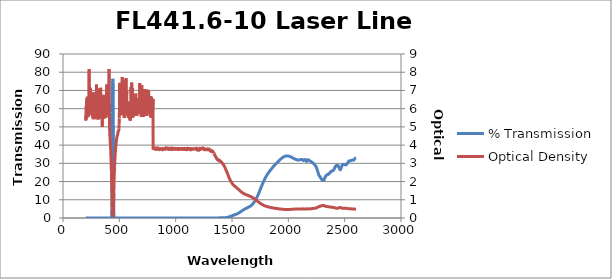
| Category | % Transmission |
|---|---|
| 2600.0 | 33.097 |
| 2599.0 | 33.076 |
| 2598.0 | 33.034 |
| 2597.0 | 32.991 |
| 2596.0 | 32.96 |
| 2595.0 | 32.897 |
| 2594.0 | 32.834 |
| 2593.0 | 32.757 |
| 2592.0 | 32.676 |
| 2591.0 | 32.586 |
| 2590.0 | 32.515 |
| 2589.0 | 32.423 |
| 2588.0 | 32.32 |
| 2587.0 | 32.237 |
| 2586.0 | 32.16 |
| 2585.0 | 32.076 |
| 2584.0 | 31.991 |
| 2583.0 | 31.912 |
| 2582.0 | 31.842 |
| 2581.0 | 31.788 |
| 2580.0 | 31.757 |
| 2579.0 | 31.745 |
| 2578.0 | 31.735 |
| 2577.0 | 31.734 |
| 2576.0 | 31.748 |
| 2575.0 | 31.771 |
| 2574.0 | 31.798 |
| 2573.0 | 31.811 |
| 2572.0 | 31.817 |
| 2571.0 | 31.827 |
| 2570.0 | 31.828 |
| 2569.0 | 31.82 |
| 2568.0 | 31.813 |
| 2567.0 | 31.79 |
| 2566.0 | 31.767 |
| 2565.0 | 31.753 |
| 2564.0 | 31.729 |
| 2563.0 | 31.7 |
| 2562.0 | 31.67 |
| 2561.0 | 31.643 |
| 2560.0 | 31.609 |
| 2559.0 | 31.592 |
| 2558.0 | 31.553 |
| 2557.0 | 31.516 |
| 2556.0 | 31.494 |
| 2555.0 | 31.468 |
| 2554.0 | 31.425 |
| 2553.0 | 31.412 |
| 2552.0 | 31.413 |
| 2551.0 | 31.398 |
| 2550.0 | 31.425 |
| 2549.0 | 31.439 |
| 2548.0 | 31.439 |
| 2547.0 | 31.455 |
| 2546.0 | 31.467 |
| 2545.0 | 31.434 |
| 2544.0 | 31.426 |
| 2543.0 | 31.407 |
| 2542.0 | 31.363 |
| 2541.0 | 31.338 |
| 2540.0 | 31.312 |
| 2539.0 | 31.266 |
| 2538.0 | 31.234 |
| 2537.0 | 31.201 |
| 2536.0 | 31.14 |
| 2535.0 | 31.068 |
| 2534.0 | 30.985 |
| 2533.0 | 30.883 |
| 2532.0 | 30.793 |
| 2531.0 | 30.695 |
| 2530.0 | 30.592 |
| 2529.0 | 30.513 |
| 2528.0 | 30.434 |
| 2527.0 | 30.346 |
| 2526.0 | 30.262 |
| 2525.0 | 30.18 |
| 2524.0 | 30.085 |
| 2523.0 | 29.988 |
| 2522.0 | 29.895 |
| 2521.0 | 29.799 |
| 2520.0 | 29.71 |
| 2519.0 | 29.618 |
| 2518.0 | 29.532 |
| 2517.0 | 29.445 |
| 2516.0 | 29.372 |
| 2515.0 | 29.309 |
| 2514.0 | 29.26 |
| 2513.0 | 29.217 |
| 2512.0 | 29.184 |
| 2511.0 | 29.152 |
| 2510.0 | 29.129 |
| 2509.0 | 29.114 |
| 2508.0 | 29.114 |
| 2507.0 | 29.12 |
| 2506.0 | 29.134 |
| 2505.0 | 29.153 |
| 2504.0 | 29.173 |
| 2503.0 | 29.196 |
| 2502.0 | 29.216 |
| 2501.0 | 29.245 |
| 2500.0 | 29.262 |
| 2499.0 | 29.299 |
| 2498.0 | 29.311 |
| 2497.0 | 29.335 |
| 2496.0 | 29.341 |
| 2495.0 | 29.348 |
| 2494.0 | 29.34 |
| 2493.0 | 29.349 |
| 2492.0 | 29.343 |
| 2491.0 | 29.355 |
| 2490.0 | 29.35 |
| 2489.0 | 29.339 |
| 2488.0 | 29.333 |
| 2487.0 | 29.339 |
| 2486.0 | 29.326 |
| 2485.0 | 29.339 |
| 2484.0 | 29.338 |
| 2483.0 | 29.317 |
| 2482.0 | 29.29 |
| 2481.0 | 29.234 |
| 2480.0 | 29.155 |
| 2479.0 | 29.076 |
| 2478.0 | 28.978 |
| 2477.0 | 28.862 |
| 2476.0 | 28.756 |
| 2475.0 | 28.604 |
| 2474.0 | 28.452 |
| 2473.0 | 28.291 |
| 2472.0 | 28.107 |
| 2471.0 | 27.926 |
| 2470.0 | 27.763 |
| 2469.0 | 27.553 |
| 2468.0 | 27.388 |
| 2467.0 | 27.193 |
| 2466.0 | 26.995 |
| 2465.0 | 26.831 |
| 2464.0 | 26.701 |
| 2463.0 | 26.574 |
| 2462.0 | 26.541 |
| 2461.0 | 26.501 |
| 2460.0 | 26.503 |
| 2459.0 | 26.556 |
| 2458.0 | 26.615 |
| 2457.0 | 26.707 |
| 2456.0 | 26.857 |
| 2455.0 | 26.957 |
| 2454.0 | 27.1 |
| 2453.0 | 27.226 |
| 2452.0 | 27.323 |
| 2451.0 | 27.448 |
| 2450.0 | 27.59 |
| 2449.0 | 27.704 |
| 2448.0 | 27.883 |
| 2447.0 | 28.006 |
| 2446.0 | 28.129 |
| 2445.0 | 28.266 |
| 2444.0 | 28.369 |
| 2443.0 | 28.484 |
| 2442.0 | 28.626 |
| 2441.0 | 28.706 |
| 2440.0 | 28.813 |
| 2439.0 | 28.882 |
| 2438.0 | 28.884 |
| 2437.0 | 28.932 |
| 2436.0 | 28.956 |
| 2435.0 | 28.957 |
| 2434.0 | 29.018 |
| 2433.0 | 28.997 |
| 2432.0 | 28.965 |
| 2431.0 | 28.96 |
| 2430.0 | 28.883 |
| 2429.0 | 28.867 |
| 2428.0 | 28.873 |
| 2427.0 | 28.818 |
| 2426.0 | 28.817 |
| 2425.0 | 28.756 |
| 2424.0 | 28.649 |
| 2423.0 | 28.612 |
| 2422.0 | 28.526 |
| 2421.0 | 28.47 |
| 2420.0 | 28.45 |
| 2419.0 | 28.34 |
| 2418.0 | 28.25 |
| 2417.0 | 28.15 |
| 2416.0 | 28.002 |
| 2415.0 | 27.94 |
| 2414.0 | 27.848 |
| 2413.0 | 27.728 |
| 2412.0 | 27.645 |
| 2411.0 | 27.461 |
| 2410.0 | 27.301 |
| 2409.0 | 27.181 |
| 2408.0 | 27.013 |
| 2407.0 | 26.924 |
| 2406.0 | 26.825 |
| 2405.0 | 26.663 |
| 2404.0 | 26.563 |
| 2403.0 | 26.42 |
| 2402.0 | 26.319 |
| 2401.0 | 26.304 |
| 2400.0 | 26.244 |
| 2399.0 | 26.233 |
| 2398.0 | 26.193 |
| 2397.0 | 26.1 |
| 2396.0 | 26.074 |
| 2395.0 | 26.032 |
| 2394.0 | 26.006 |
| 2393.0 | 26.045 |
| 2392.0 | 25.985 |
| 2391.0 | 25.944 |
| 2390.0 | 25.894 |
| 2389.0 | 25.802 |
| 2388.0 | 25.814 |
| 2387.0 | 25.799 |
| 2386.0 | 25.792 |
| 2385.0 | 25.781 |
| 2384.0 | 25.705 |
| 2383.0 | 25.638 |
| 2382.0 | 25.618 |
| 2381.0 | 25.56 |
| 2380.0 | 25.594 |
| 2379.0 | 25.536 |
| 2378.0 | 25.471 |
| 2377.0 | 25.39 |
| 2376.0 | 25.277 |
| 2375.0 | 25.214 |
| 2374.0 | 25.184 |
| 2373.0 | 25.126 |
| 2372.0 | 25.073 |
| 2371.0 | 24.97 |
| 2370.0 | 24.848 |
| 2369.0 | 24.792 |
| 2368.0 | 24.7 |
| 2367.0 | 24.71 |
| 2366.0 | 24.647 |
| 2365.0 | 24.581 |
| 2364.0 | 24.501 |
| 2363.0 | 24.42 |
| 2362.0 | 24.378 |
| 2361.0 | 24.387 |
| 2360.0 | 24.369 |
| 2359.0 | 24.356 |
| 2358.0 | 24.282 |
| 2357.0 | 24.178 |
| 2356.0 | 24.137 |
| 2355.0 | 24.055 |
| 2354.0 | 24.068 |
| 2353.0 | 24.004 |
| 2352.0 | 23.946 |
| 2351.0 | 23.861 |
| 2350.0 | 23.781 |
| 2349.0 | 23.756 |
| 2348.0 | 23.765 |
| 2347.0 | 23.772 |
| 2346.0 | 23.762 |
| 2345.0 | 23.717 |
| 2344.0 | 23.641 |
| 2343.0 | 23.632 |
| 2342.0 | 23.587 |
| 2341.0 | 23.631 |
| 2340.0 | 23.584 |
| 2339.0 | 23.524 |
| 2338.0 | 23.451 |
| 2337.0 | 23.341 |
| 2336.0 | 23.305 |
| 2335.0 | 23.25 |
| 2334.0 | 23.197 |
| 2333.0 | 23.111 |
| 2332.0 | 22.973 |
| 2331.0 | 22.854 |
| 2330.0 | 22.752 |
| 2329.0 | 22.65 |
| 2328.0 | 22.598 |
| 2327.0 | 22.459 |
| 2326.0 | 22.337 |
| 2325.0 | 22.171 |
| 2324.0 | 21.999 |
| 2323.0 | 21.887 |
| 2322.0 | 21.725 |
| 2321.0 | 21.579 |
| 2320.0 | 21.396 |
| 2319.0 | 21.189 |
| 2318.0 | 21.052 |
| 2317.0 | 20.906 |
| 2316.0 | 20.84 |
| 2315.0 | 20.795 |
| 2314.0 | 20.727 |
| 2313.0 | 20.715 |
| 2312.0 | 20.678 |
| 2311.0 | 20.701 |
| 2310.0 | 20.742 |
| 2309.0 | 20.771 |
| 2308.0 | 20.809 |
| 2307.0 | 20.806 |
| 2306.0 | 20.806 |
| 2305.0 | 20.826 |
| 2304.0 | 20.838 |
| 2303.0 | 20.882 |
| 2302.0 | 20.905 |
| 2301.0 | 20.921 |
| 2300.0 | 20.967 |
| 2299.0 | 20.998 |
| 2298.0 | 21.082 |
| 2297.0 | 21.144 |
| 2296.0 | 21.233 |
| 2295.0 | 21.309 |
| 2294.0 | 21.38 |
| 2293.0 | 21.467 |
| 2292.0 | 21.554 |
| 2291.0 | 21.658 |
| 2290.0 | 21.755 |
| 2289.0 | 21.854 |
| 2288.0 | 21.951 |
| 2287.0 | 22.052 |
| 2286.0 | 22.158 |
| 2285.0 | 22.268 |
| 2284.0 | 22.373 |
| 2283.0 | 22.481 |
| 2282.0 | 22.57 |
| 2281.0 | 22.663 |
| 2280.0 | 22.739 |
| 2279.0 | 22.821 |
| 2278.0 | 22.889 |
| 2277.0 | 22.956 |
| 2276.0 | 23.037 |
| 2275.0 | 23.103 |
| 2274.0 | 23.207 |
| 2273.0 | 23.305 |
| 2272.0 | 23.437 |
| 2271.0 | 23.582 |
| 2270.0 | 23.742 |
| 2269.0 | 23.938 |
| 2268.0 | 24.116 |
| 2267.0 | 24.321 |
| 2266.0 | 24.516 |
| 2265.0 | 24.714 |
| 2264.0 | 24.928 |
| 2263.0 | 25.122 |
| 2262.0 | 25.334 |
| 2261.0 | 25.521 |
| 2260.0 | 25.719 |
| 2259.0 | 25.914 |
| 2258.0 | 26.093 |
| 2257.0 | 26.299 |
| 2256.0 | 26.481 |
| 2255.0 | 26.669 |
| 2254.0 | 26.856 |
| 2253.0 | 27.028 |
| 2252.0 | 27.202 |
| 2251.0 | 27.366 |
| 2250.0 | 27.541 |
| 2249.0 | 27.694 |
| 2248.0 | 27.841 |
| 2247.0 | 27.986 |
| 2246.0 | 28.114 |
| 2245.0 | 28.239 |
| 2244.0 | 28.36 |
| 2243.0 | 28.479 |
| 2242.0 | 28.578 |
| 2241.0 | 28.671 |
| 2240.0 | 28.76 |
| 2239.0 | 28.838 |
| 2238.0 | 28.926 |
| 2237.0 | 29.003 |
| 2236.0 | 29.072 |
| 2235.0 | 29.137 |
| 2234.0 | 29.2 |
| 2233.0 | 29.269 |
| 2232.0 | 29.341 |
| 2231.0 | 29.418 |
| 2230.0 | 29.497 |
| 2229.0 | 29.561 |
| 2228.0 | 29.636 |
| 2227.0 | 29.71 |
| 2226.0 | 29.792 |
| 2225.0 | 29.871 |
| 2224.0 | 29.937 |
| 2223.0 | 29.999 |
| 2222.0 | 30.055 |
| 2221.0 | 30.11 |
| 2220.0 | 30.172 |
| 2219.0 | 30.213 |
| 2218.0 | 30.26 |
| 2217.0 | 30.297 |
| 2216.0 | 30.325 |
| 2215.0 | 30.372 |
| 2214.0 | 30.409 |
| 2213.0 | 30.449 |
| 2212.0 | 30.485 |
| 2211.0 | 30.509 |
| 2210.0 | 30.555 |
| 2209.0 | 30.601 |
| 2208.0 | 30.65 |
| 2207.0 | 30.7 |
| 2206.0 | 30.737 |
| 2205.0 | 30.783 |
| 2204.0 | 30.832 |
| 2203.0 | 30.888 |
| 2202.0 | 30.944 |
| 2201.0 | 30.986 |
| 2200.0 | 31.025 |
| 2199.0 | 31.071 |
| 2198.0 | 31.103 |
| 2197.0 | 31.156 |
| 2196.0 | 31.185 |
| 2195.0 | 31.208 |
| 2194.0 | 31.232 |
| 2193.0 | 31.252 |
| 2192.0 | 31.289 |
| 2191.0 | 31.323 |
| 2190.0 | 31.354 |
| 2189.0 | 31.391 |
| 2188.0 | 31.434 |
| 2187.0 | 31.485 |
| 2186.0 | 31.557 |
| 2185.0 | 31.62 |
| 2184.0 | 31.679 |
| 2183.0 | 31.741 |
| 2182.0 | 31.789 |
| 2181.0 | 31.848 |
| 2180.0 | 31.897 |
| 2179.0 | 31.935 |
| 2178.0 | 31.96 |
| 2177.0 | 31.969 |
| 2176.0 | 31.974 |
| 2175.0 | 31.96 |
| 2174.0 | 31.938 |
| 2173.0 | 31.89 |
| 2172.0 | 31.825 |
| 2171.0 | 31.739 |
| 2170.0 | 31.639 |
| 2169.0 | 31.52 |
| 2168.0 | 31.407 |
| 2167.0 | 31.286 |
| 2166.0 | 31.182 |
| 2165.0 | 31.111 |
| 2164.0 | 31.062 |
| 2163.0 | 31.054 |
| 2162.0 | 31.074 |
| 2161.0 | 31.132 |
| 2160.0 | 31.212 |
| 2159.0 | 31.315 |
| 2158.0 | 31.421 |
| 2157.0 | 31.536 |
| 2156.0 | 31.645 |
| 2155.0 | 31.754 |
| 2154.0 | 31.853 |
| 2153.0 | 31.938 |
| 2152.0 | 32.005 |
| 2151.0 | 32.057 |
| 2150.0 | 32.095 |
| 2149.0 | 32.11 |
| 2148.0 | 32.115 |
| 2147.0 | 32.1 |
| 2146.0 | 32.074 |
| 2145.0 | 32.031 |
| 2144.0 | 31.976 |
| 2143.0 | 31.909 |
| 2142.0 | 31.839 |
| 2141.0 | 31.757 |
| 2140.0 | 31.679 |
| 2139.0 | 31.607 |
| 2138.0 | 31.542 |
| 2137.0 | 31.5 |
| 2136.0 | 31.477 |
| 2135.0 | 31.478 |
| 2134.0 | 31.508 |
| 2133.0 | 31.563 |
| 2132.0 | 31.625 |
| 2131.0 | 31.707 |
| 2130.0 | 31.788 |
| 2129.0 | 31.865 |
| 2128.0 | 31.938 |
| 2127.0 | 31.992 |
| 2126.0 | 32.033 |
| 2125.0 | 32.06 |
| 2124.0 | 32.08 |
| 2123.0 | 32.09 |
| 2122.0 | 32.091 |
| 2121.0 | 32.091 |
| 2120.0 | 32.091 |
| 2119.0 | 32.092 |
| 2118.0 | 32.091 |
| 2117.0 | 32.081 |
| 2116.0 | 32.079 |
| 2115.0 | 32.075 |
| 2114.0 | 32.068 |
| 2113.0 | 32.064 |
| 2112.0 | 32.052 |
| 2111.0 | 32.037 |
| 2110.0 | 32.029 |
| 2109.0 | 32.018 |
| 2108.0 | 32.008 |
| 2107.0 | 32 |
| 2106.0 | 31.987 |
| 2105.0 | 31.972 |
| 2104.0 | 31.962 |
| 2103.0 | 31.954 |
| 2102.0 | 31.943 |
| 2101.0 | 31.929 |
| 2100.0 | 31.915 |
| 2099.0 | 31.906 |
| 2098.0 | 31.895 |
| 2097.0 | 31.886 |
| 2096.0 | 31.873 |
| 2095.0 | 31.863 |
| 2094.0 | 31.856 |
| 2093.0 | 31.852 |
| 2092.0 | 31.845 |
| 2091.0 | 31.838 |
| 2090.0 | 31.832 |
| 2089.0 | 31.829 |
| 2088.0 | 31.834 |
| 2087.0 | 31.834 |
| 2086.0 | 31.828 |
| 2085.0 | 31.833 |
| 2084.0 | 31.842 |
| 2083.0 | 31.847 |
| 2082.0 | 31.86 |
| 2081.0 | 31.865 |
| 2080.0 | 31.876 |
| 2079.0 | 31.892 |
| 2078.0 | 31.908 |
| 2077.0 | 31.927 |
| 2076.0 | 31.941 |
| 2075.0 | 31.958 |
| 2074.0 | 31.98 |
| 2073.0 | 32 |
| 2072.0 | 32.022 |
| 2071.0 | 32.048 |
| 2070.0 | 32.065 |
| 2069.0 | 32.091 |
| 2068.0 | 32.119 |
| 2067.0 | 32.142 |
| 2066.0 | 32.167 |
| 2065.0 | 32.191 |
| 2064.0 | 32.221 |
| 2063.0 | 32.25 |
| 2062.0 | 32.276 |
| 2061.0 | 32.305 |
| 2060.0 | 32.326 |
| 2059.0 | 32.356 |
| 2058.0 | 32.391 |
| 2057.0 | 32.419 |
| 2056.0 | 32.444 |
| 2055.0 | 32.471 |
| 2054.0 | 32.501 |
| 2053.0 | 32.536 |
| 2052.0 | 32.562 |
| 2051.0 | 32.594 |
| 2050.0 | 32.618 |
| 2049.0 | 32.651 |
| 2048.0 | 32.691 |
| 2047.0 | 32.718 |
| 2046.0 | 32.742 |
| 2045.0 | 32.778 |
| 2044.0 | 32.815 |
| 2043.0 | 32.851 |
| 2042.0 | 32.879 |
| 2041.0 | 32.913 |
| 2040.0 | 32.947 |
| 2039.0 | 32.979 |
| 2038.0 | 33.024 |
| 2037.0 | 33.057 |
| 2036.0 | 33.089 |
| 2035.0 | 33.122 |
| 2034.0 | 33.162 |
| 2033.0 | 33.2 |
| 2032.0 | 33.231 |
| 2031.0 | 33.266 |
| 2030.0 | 33.298 |
| 2029.0 | 33.336 |
| 2028.0 | 33.365 |
| 2027.0 | 33.396 |
| 2026.0 | 33.427 |
| 2025.0 | 33.459 |
| 2024.0 | 33.492 |
| 2023.0 | 33.516 |
| 2022.0 | 33.55 |
| 2021.0 | 33.571 |
| 2020.0 | 33.603 |
| 2019.0 | 33.63 |
| 2018.0 | 33.66 |
| 2017.0 | 33.677 |
| 2016.0 | 33.7 |
| 2015.0 | 33.735 |
| 2014.0 | 33.754 |
| 2013.0 | 33.776 |
| 2012.0 | 33.793 |
| 2011.0 | 33.823 |
| 2010.0 | 33.843 |
| 2009.0 | 33.866 |
| 2008.0 | 33.881 |
| 2007.0 | 33.906 |
| 2006.0 | 33.927 |
| 2005.0 | 33.942 |
| 2004.0 | 33.962 |
| 2003.0 | 33.977 |
| 2002.0 | 33.992 |
| 2001.0 | 34.005 |
| 2000.0 | 34.02 |
| 1999.0 | 34.034 |
| 1998.0 | 34.045 |
| 1997.0 | 34.05 |
| 1996.0 | 34.065 |
| 1995.0 | 34.067 |
| 1994.0 | 34.077 |
| 1993.0 | 34.079 |
| 1992.0 | 34.086 |
| 1991.0 | 34.092 |
| 1990.0 | 34.094 |
| 1989.0 | 34.091 |
| 1988.0 | 34.089 |
| 1987.0 | 34.094 |
| 1986.0 | 34.088 |
| 1985.0 | 34.081 |
| 1984.0 | 34.074 |
| 1983.0 | 34.069 |
| 1982.0 | 34.061 |
| 1981.0 | 34.053 |
| 1980.0 | 34.029 |
| 1979.0 | 34.024 |
| 1978.0 | 34.012 |
| 1977.0 | 33.999 |
| 1976.0 | 33.981 |
| 1975.0 | 33.966 |
| 1974.0 | 33.949 |
| 1973.0 | 33.929 |
| 1972.0 | 33.907 |
| 1971.0 | 33.879 |
| 1970.0 | 33.866 |
| 1969.0 | 33.845 |
| 1968.0 | 33.82 |
| 1967.0 | 33.79 |
| 1966.0 | 33.761 |
| 1965.0 | 33.739 |
| 1964.0 | 33.714 |
| 1963.0 | 33.68 |
| 1962.0 | 33.65 |
| 1961.0 | 33.621 |
| 1960.0 | 33.59 |
| 1959.0 | 33.56 |
| 1958.0 | 33.521 |
| 1957.0 | 33.488 |
| 1956.0 | 33.456 |
| 1955.0 | 33.42 |
| 1954.0 | 33.378 |
| 1953.0 | 33.337 |
| 1952.0 | 33.302 |
| 1951.0 | 33.264 |
| 1950.0 | 33.222 |
| 1949.0 | 33.172 |
| 1948.0 | 33.131 |
| 1947.0 | 33.086 |
| 1946.0 | 33.046 |
| 1945.0 | 32.996 |
| 1944.0 | 32.945 |
| 1943.0 | 32.892 |
| 1942.0 | 32.849 |
| 1941.0 | 32.799 |
| 1940.0 | 32.748 |
| 1939.0 | 32.691 |
| 1938.0 | 32.634 |
| 1937.0 | 32.578 |
| 1936.0 | 32.523 |
| 1935.0 | 32.474 |
| 1934.0 | 32.423 |
| 1933.0 | 32.37 |
| 1932.0 | 32.313 |
| 1931.0 | 32.27 |
| 1930.0 | 32.224 |
| 1929.0 | 32.168 |
| 1928.0 | 32.112 |
| 1927.0 | 32.051 |
| 1926.0 | 31.995 |
| 1925.0 | 31.925 |
| 1924.0 | 31.856 |
| 1923.0 | 31.795 |
| 1922.0 | 31.751 |
| 1921.0 | 31.705 |
| 1920.0 | 31.646 |
| 1919.0 | 31.579 |
| 1918.0 | 31.515 |
| 1917.0 | 31.462 |
| 1916.0 | 31.409 |
| 1915.0 | 31.349 |
| 1914.0 | 31.291 |
| 1913.0 | 31.226 |
| 1912.0 | 31.149 |
| 1911.0 | 31.075 |
| 1910.0 | 31.014 |
| 1909.0 | 30.959 |
| 1908.0 | 30.906 |
| 1907.0 | 30.835 |
| 1906.0 | 30.77 |
| 1905.0 | 30.717 |
| 1904.0 | 30.657 |
| 1903.0 | 30.605 |
| 1902.0 | 30.547 |
| 1901.0 | 30.483 |
| 1900.0 | 30.418 |
| 1899.0 | 30.353 |
| 1898.0 | 30.294 |
| 1897.0 | 30.24 |
| 1896.0 | 30.18 |
| 1895.0 | 30.112 |
| 1894.0 | 30.044 |
| 1893.0 | 29.984 |
| 1892.0 | 29.931 |
| 1891.0 | 29.862 |
| 1890.0 | 29.786 |
| 1889.0 | 29.718 |
| 1888.0 | 29.664 |
| 1887.0 | 29.608 |
| 1886.0 | 29.544 |
| 1885.0 | 29.476 |
| 1884.0 | 29.404 |
| 1883.0 | 29.336 |
| 1882.0 | 29.267 |
| 1881.0 | 29.201 |
| 1880.0 | 29.133 |
| 1879.0 | 29.068 |
| 1878.0 | 28.992 |
| 1877.0 | 28.913 |
| 1876.0 | 28.849 |
| 1875.0 | 28.803 |
| 1874.0 | 28.748 |
| 1873.0 | 28.685 |
| 1872.0 | 28.608 |
| 1871.0 | 28.522 |
| 1870.0 | 28.454 |
| 1869.0 | 28.372 |
| 1868.0 | 28.286 |
| 1867.0 | 28.207 |
| 1866.0 | 28.136 |
| 1865.0 | 28.066 |
| 1864.0 | 27.988 |
| 1863.0 | 27.918 |
| 1862.0 | 27.845 |
| 1861.0 | 27.765 |
| 1860.0 | 27.679 |
| 1859.0 | 27.606 |
| 1858.0 | 27.548 |
| 1857.0 | 27.488 |
| 1856.0 | 27.417 |
| 1855.0 | 27.324 |
| 1854.0 | 27.234 |
| 1853.0 | 27.147 |
| 1852.0 | 27.075 |
| 1851.0 | 27.007 |
| 1850.0 | 26.949 |
| 1849.0 | 26.867 |
| 1848.0 | 26.773 |
| 1847.0 | 26.682 |
| 1846.0 | 26.602 |
| 1845.0 | 26.536 |
| 1844.0 | 26.477 |
| 1843.0 | 26.413 |
| 1842.0 | 26.335 |
| 1841.0 | 26.247 |
| 1840.0 | 26.162 |
| 1839.0 | 26.082 |
| 1838.0 | 26.009 |
| 1837.0 | 25.94 |
| 1836.0 | 25.859 |
| 1835.0 | 25.773 |
| 1834.0 | 25.683 |
| 1833.0 | 25.595 |
| 1832.0 | 25.502 |
| 1831.0 | 25.405 |
| 1830.0 | 25.317 |
| 1829.0 | 25.224 |
| 1828.0 | 25.163 |
| 1827.0 | 25.085 |
| 1826.0 | 25.008 |
| 1825.0 | 24.91 |
| 1824.0 | 24.828 |
| 1823.0 | 24.748 |
| 1822.0 | 24.661 |
| 1821.0 | 24.577 |
| 1820.0 | 24.472 |
| 1819.0 | 24.382 |
| 1818.0 | 24.287 |
| 1817.0 | 24.204 |
| 1816.0 | 24.105 |
| 1815.0 | 24.011 |
| 1814.0 | 23.919 |
| 1813.0 | 23.823 |
| 1812.0 | 23.731 |
| 1811.0 | 23.625 |
| 1810.0 | 23.529 |
| 1809.0 | 23.433 |
| 1808.0 | 23.336 |
| 1807.0 | 23.232 |
| 1806.0 | 23.126 |
| 1805.0 | 23.025 |
| 1804.0 | 22.919 |
| 1803.0 | 22.82 |
| 1802.0 | 22.714 |
| 1801.0 | 22.602 |
| 1800.0 | 22.491 |
| 1799.0 | 22.378 |
| 1798.0 | 22.272 |
| 1797.0 | 22.156 |
| 1796.0 | 22.042 |
| 1795.0 | 21.924 |
| 1794.0 | 21.804 |
| 1793.0 | 21.688 |
| 1792.0 | 21.566 |
| 1791.0 | 21.449 |
| 1790.0 | 21.323 |
| 1789.0 | 21.206 |
| 1788.0 | 21.074 |
| 1787.0 | 20.945 |
| 1786.0 | 20.821 |
| 1785.0 | 20.69 |
| 1784.0 | 20.559 |
| 1783.0 | 20.424 |
| 1782.0 | 20.29 |
| 1781.0 | 20.147 |
| 1780.0 | 20.01 |
| 1779.0 | 19.871 |
| 1778.0 | 19.725 |
| 1777.0 | 19.583 |
| 1776.0 | 19.434 |
| 1775.0 | 19.286 |
| 1774.0 | 19.14 |
| 1773.0 | 18.99 |
| 1772.0 | 18.84 |
| 1771.0 | 18.692 |
| 1770.0 | 18.547 |
| 1769.0 | 18.395 |
| 1768.0 | 18.246 |
| 1767.0 | 18.102 |
| 1766.0 | 17.954 |
| 1765.0 | 17.809 |
| 1764.0 | 17.668 |
| 1763.0 | 17.522 |
| 1762.0 | 17.368 |
| 1761.0 | 17.224 |
| 1760.0 | 17.08 |
| 1759.0 | 16.926 |
| 1758.0 | 16.781 |
| 1757.0 | 16.63 |
| 1756.0 | 16.475 |
| 1755.0 | 16.318 |
| 1754.0 | 16.164 |
| 1753.0 | 16.01 |
| 1752.0 | 15.848 |
| 1751.0 | 15.693 |
| 1750.0 | 15.53 |
| 1749.0 | 15.369 |
| 1748.0 | 15.21 |
| 1747.0 | 15.046 |
| 1746.0 | 14.891 |
| 1745.0 | 14.73 |
| 1744.0 | 14.569 |
| 1743.0 | 14.403 |
| 1742.0 | 14.242 |
| 1741.0 | 14.088 |
| 1740.0 | 13.929 |
| 1739.0 | 13.779 |
| 1738.0 | 13.633 |
| 1737.0 | 13.477 |
| 1736.0 | 13.33 |
| 1735.0 | 13.19 |
| 1734.0 | 13.044 |
| 1733.0 | 12.905 |
| 1732.0 | 12.775 |
| 1731.0 | 12.637 |
| 1730.0 | 12.494 |
| 1729.0 | 12.359 |
| 1728.0 | 12.233 |
| 1727.0 | 12.095 |
| 1726.0 | 11.956 |
| 1725.0 | 11.83 |
| 1724.0 | 11.694 |
| 1723.0 | 11.557 |
| 1722.0 | 11.437 |
| 1721.0 | 11.316 |
| 1720.0 | 11.19 |
| 1719.0 | 11.071 |
| 1718.0 | 10.959 |
| 1717.0 | 10.843 |
| 1716.0 | 10.723 |
| 1715.0 | 10.616 |
| 1714.0 | 10.505 |
| 1713.0 | 10.388 |
| 1712.0 | 10.273 |
| 1711.0 | 10.158 |
| 1710.0 | 10.042 |
| 1709.0 | 9.927 |
| 1708.0 | 9.817 |
| 1707.0 | 9.706 |
| 1706.0 | 9.595 |
| 1705.0 | 9.484 |
| 1704.0 | 9.376 |
| 1703.0 | 9.27 |
| 1702.0 | 9.164 |
| 1701.0 | 9.068 |
| 1700.0 | 8.971 |
| 1699.0 | 8.88 |
| 1698.0 | 8.797 |
| 1697.0 | 8.714 |
| 1696.0 | 8.631 |
| 1695.0 | 8.556 |
| 1694.0 | 8.481 |
| 1693.0 | 8.393 |
| 1692.0 | 8.305 |
| 1691.0 | 8.225 |
| 1690.0 | 8.142 |
| 1689.0 | 8.061 |
| 1688.0 | 7.985 |
| 1687.0 | 7.922 |
| 1686.0 | 7.854 |
| 1685.0 | 7.785 |
| 1684.0 | 7.733 |
| 1683.0 | 7.665 |
| 1682.0 | 7.601 |
| 1681.0 | 7.544 |
| 1680.0 | 7.477 |
| 1679.0 | 7.404 |
| 1678.0 | 7.332 |
| 1677.0 | 7.265 |
| 1676.0 | 7.187 |
| 1675.0 | 7.115 |
| 1674.0 | 7.049 |
| 1673.0 | 6.974 |
| 1672.0 | 6.905 |
| 1671.0 | 6.85 |
| 1670.0 | 6.792 |
| 1669.0 | 6.736 |
| 1668.0 | 6.689 |
| 1667.0 | 6.65 |
| 1666.0 | 6.608 |
| 1665.0 | 6.576 |
| 1664.0 | 6.541 |
| 1663.0 | 6.511 |
| 1662.0 | 6.481 |
| 1661.0 | 6.453 |
| 1660.0 | 6.412 |
| 1659.0 | 6.373 |
| 1658.0 | 6.345 |
| 1657.0 | 6.305 |
| 1656.0 | 6.265 |
| 1655.0 | 6.228 |
| 1654.0 | 6.187 |
| 1653.0 | 6.147 |
| 1652.0 | 6.113 |
| 1651.0 | 6.075 |
| 1650.0 | 6.035 |
| 1649.0 | 6 |
| 1648.0 | 5.966 |
| 1647.0 | 5.926 |
| 1646.0 | 5.89 |
| 1645.0 | 5.862 |
| 1644.0 | 5.827 |
| 1643.0 | 5.799 |
| 1642.0 | 5.771 |
| 1641.0 | 5.735 |
| 1640.0 | 5.704 |
| 1639.0 | 5.675 |
| 1638.0 | 5.644 |
| 1637.0 | 5.607 |
| 1636.0 | 5.577 |
| 1635.0 | 5.548 |
| 1634.0 | 5.512 |
| 1633.0 | 5.485 |
| 1632.0 | 5.458 |
| 1631.0 | 5.423 |
| 1630.0 | 5.399 |
| 1629.0 | 5.369 |
| 1628.0 | 5.336 |
| 1627.0 | 5.307 |
| 1626.0 | 5.276 |
| 1625.0 | 5.244 |
| 1624.0 | 5.215 |
| 1623.0 | 5.188 |
| 1622.0 | 5.156 |
| 1621.0 | 5.121 |
| 1620.0 | 5.09 |
| 1619.0 | 5.061 |
| 1618.0 | 5.03 |
| 1617.0 | 5.001 |
| 1616.0 | 4.967 |
| 1615.0 | 4.933 |
| 1614.0 | 4.902 |
| 1613.0 | 4.872 |
| 1612.0 | 4.836 |
| 1611.0 | 4.805 |
| 1610.0 | 4.771 |
| 1609.0 | 4.735 |
| 1608.0 | 4.7 |
| 1607.0 | 4.668 |
| 1606.0 | 4.632 |
| 1605.0 | 4.598 |
| 1604.0 | 4.558 |
| 1603.0 | 4.522 |
| 1602.0 | 4.486 |
| 1601.0 | 4.447 |
| 1600.0 | 4.41 |
| 1599.0 | 4.372 |
| 1598.0 | 4.332 |
| 1597.0 | 4.295 |
| 1596.0 | 4.258 |
| 1595.0 | 4.214 |
| 1594.0 | 4.173 |
| 1593.0 | 4.133 |
| 1592.0 | 4.094 |
| 1591.0 | 4.051 |
| 1590.0 | 4.012 |
| 1589.0 | 3.968 |
| 1588.0 | 3.923 |
| 1587.0 | 3.884 |
| 1586.0 | 3.84 |
| 1585.0 | 3.795 |
| 1584.0 | 3.75 |
| 1583.0 | 3.708 |
| 1582.0 | 3.668 |
| 1581.0 | 3.624 |
| 1580.0 | 3.582 |
| 1579.0 | 3.538 |
| 1578.0 | 3.497 |
| 1577.0 | 3.45 |
| 1576.0 | 3.408 |
| 1575.0 | 3.371 |
| 1574.0 | 3.326 |
| 1573.0 | 3.283 |
| 1572.0 | 3.244 |
| 1571.0 | 3.202 |
| 1570.0 | 3.161 |
| 1569.0 | 3.121 |
| 1568.0 | 3.082 |
| 1567.0 | 3.041 |
| 1566.0 | 3.001 |
| 1565.0 | 2.965 |
| 1564.0 | 2.922 |
| 1563.0 | 2.886 |
| 1562.0 | 2.845 |
| 1561.0 | 2.812 |
| 1560.0 | 2.773 |
| 1559.0 | 2.736 |
| 1558.0 | 2.701 |
| 1557.0 | 2.664 |
| 1556.0 | 2.631 |
| 1555.0 | 2.596 |
| 1554.0 | 2.561 |
| 1553.0 | 2.529 |
| 1552.0 | 2.499 |
| 1551.0 | 2.462 |
| 1550.0 | 2.431 |
| 1549.0 | 2.399 |
| 1548.0 | 2.365 |
| 1547.0 | 2.338 |
| 1546.0 | 2.31 |
| 1545.0 | 2.28 |
| 1544.0 | 2.25 |
| 1543.0 | 2.224 |
| 1542.0 | 2.194 |
| 1541.0 | 2.17 |
| 1540.0 | 2.14 |
| 1539.0 | 2.115 |
| 1538.0 | 2.09 |
| 1537.0 | 2.065 |
| 1536.0 | 2.04 |
| 1535.0 | 2.015 |
| 1534.0 | 1.992 |
| 1533.0 | 1.969 |
| 1532.0 | 1.944 |
| 1531.0 | 1.921 |
| 1530.0 | 1.899 |
| 1529.0 | 1.877 |
| 1528.0 | 1.854 |
| 1527.0 | 1.833 |
| 1526.0 | 1.81 |
| 1525.0 | 1.789 |
| 1524.0 | 1.766 |
| 1523.0 | 1.749 |
| 1522.0 | 1.726 |
| 1521.0 | 1.705 |
| 1520.0 | 1.682 |
| 1519.0 | 1.661 |
| 1518.0 | 1.64 |
| 1517.0 | 1.618 |
| 1516.0 | 1.597 |
| 1515.0 | 1.574 |
| 1514.0 | 1.552 |
| 1513.0 | 1.53 |
| 1512.0 | 1.508 |
| 1511.0 | 1.487 |
| 1510.0 | 1.465 |
| 1509.0 | 1.443 |
| 1508.0 | 1.421 |
| 1507.0 | 1.395 |
| 1506.0 | 1.373 |
| 1505.0 | 1.35 |
| 1504.0 | 1.327 |
| 1503.0 | 1.302 |
| 1502.0 | 1.278 |
| 1501.0 | 1.254 |
| 1500.0 | 1.228 |
| 1499.0 | 1.206 |
| 1498.0 | 1.179 |
| 1497.0 | 1.153 |
| 1496.0 | 1.128 |
| 1495.0 | 1.104 |
| 1494.0 | 1.078 |
| 1493.0 | 1.051 |
| 1492.0 | 1.027 |
| 1491.0 | 1.001 |
| 1490.0 | 0.976 |
| 1489.0 | 0.955 |
| 1488.0 | 0.926 |
| 1487.0 | 0.9 |
| 1486.0 | 0.876 |
| 1485.0 | 0.852 |
| 1484.0 | 0.827 |
| 1483.0 | 0.801 |
| 1482.0 | 0.78 |
| 1481.0 | 0.754 |
| 1480.0 | 0.731 |
| 1479.0 | 0.71 |
| 1478.0 | 0.687 |
| 1477.0 | 0.663 |
| 1476.0 | 0.644 |
| 1475.0 | 0.619 |
| 1474.0 | 0.6 |
| 1473.0 | 0.579 |
| 1472.0 | 0.56 |
| 1471.0 | 0.542 |
| 1470.0 | 0.523 |
| 1469.0 | 0.506 |
| 1468.0 | 0.489 |
| 1467.0 | 0.472 |
| 1466.0 | 0.453 |
| 1465.0 | 0.437 |
| 1464.0 | 0.424 |
| 1463.0 | 0.407 |
| 1462.0 | 0.395 |
| 1461.0 | 0.382 |
| 1460.0 | 0.367 |
| 1459.0 | 0.354 |
| 1458.0 | 0.343 |
| 1457.0 | 0.326 |
| 1456.0 | 0.318 |
| 1455.0 | 0.305 |
| 1454.0 | 0.295 |
| 1453.0 | 0.285 |
| 1452.0 | 0.277 |
| 1451.0 | 0.267 |
| 1450.0 | 0.259 |
| 1449.0 | 0.248 |
| 1448.0 | 0.241 |
| 1447.0 | 0.233 |
| 1446.0 | 0.227 |
| 1445.0 | 0.217 |
| 1444.0 | 0.208 |
| 1443.0 | 0.203 |
| 1442.0 | 0.199 |
| 1441.0 | 0.19 |
| 1440.0 | 0.185 |
| 1439.0 | 0.18 |
| 1438.0 | 0.175 |
| 1437.0 | 0.171 |
| 1436.0 | 0.164 |
| 1435.0 | 0.159 |
| 1434.0 | 0.154 |
| 1433.0 | 0.151 |
| 1432.0 | 0.148 |
| 1431.0 | 0.141 |
| 1430.0 | 0.137 |
| 1429.0 | 0.136 |
| 1428.0 | 0.13 |
| 1427.0 | 0.129 |
| 1426.0 | 0.125 |
| 1425.0 | 0.125 |
| 1424.0 | 0.121 |
| 1423.0 | 0.121 |
| 1422.0 | 0.114 |
| 1421.0 | 0.115 |
| 1420.0 | 0.108 |
| 1419.0 | 0.108 |
| 1418.0 | 0.107 |
| 1417.0 | 0.102 |
| 1416.0 | 0.102 |
| 1415.0 | 0.101 |
| 1414.0 | 0.096 |
| 1413.0 | 0.094 |
| 1412.0 | 0.095 |
| 1411.0 | 0.093 |
| 1410.0 | 0.09 |
| 1409.0 | 0.09 |
| 1408.0 | 0.088 |
| 1407.0 | 0.087 |
| 1406.0 | 0.086 |
| 1405.0 | 0.086 |
| 1404.0 | 0.085 |
| 1403.0 | 0.081 |
| 1402.0 | 0.081 |
| 1401.0 | 0.078 |
| 1400.0 | 0.081 |
| 1399.0 | 0.078 |
| 1398.0 | 0.078 |
| 1397.0 | 0.077 |
| 1396.0 | 0.079 |
| 1395.0 | 0.075 |
| 1394.0 | 0.073 |
| 1393.0 | 0.074 |
| 1392.0 | 0.072 |
| 1391.0 | 0.072 |
| 1390.0 | 0.072 |
| 1389.0 | 0.072 |
| 1388.0 | 0.073 |
| 1387.0 | 0.069 |
| 1386.0 | 0.068 |
| 1385.0 | 0.069 |
| 1384.0 | 0.069 |
| 1383.0 | 0.072 |
| 1382.0 | 0.066 |
| 1381.0 | 0.067 |
| 1380.0 | 0.065 |
| 1379.0 | 0.064 |
| 1378.0 | 0.068 |
| 1377.0 | 0.063 |
| 1376.0 | 0.064 |
| 1375.0 | 0.063 |
| 1374.0 | 0.063 |
| 1373.0 | 0.064 |
| 1372.0 | 0.061 |
| 1371.0 | 0.061 |
| 1370.0 | 0.059 |
| 1369.0 | 0.058 |
| 1368.0 | 0.061 |
| 1367.0 | 0.056 |
| 1366.0 | 0.053 |
| 1365.0 | 0.057 |
| 1364.0 | 0.053 |
| 1363.0 | 0.052 |
| 1362.0 | 0.053 |
| 1361.0 | 0.05 |
| 1360.0 | 0.05 |
| 1359.0 | 0.05 |
| 1358.0 | 0.047 |
| 1357.0 | 0.046 |
| 1356.0 | 0.044 |
| 1355.0 | 0.044 |
| 1354.0 | 0.041 |
| 1353.0 | 0.041 |
| 1352.0 | 0.041 |
| 1351.0 | 0.038 |
| 1350.0 | 0.039 |
| 1349.0 | 0.038 |
| 1348.0 | 0.038 |
| 1347.0 | 0.036 |
| 1346.0 | 0.033 |
| 1345.0 | 0.033 |
| 1344.0 | 0.03 |
| 1343.0 | 0.029 |
| 1342.0 | 0.032 |
| 1341.0 | 0.03 |
| 1340.0 | 0.028 |
| 1339.0 | 0.027 |
| 1338.0 | 0.027 |
| 1337.0 | 0.026 |
| 1336.0 | 0.028 |
| 1335.0 | 0.024 |
| 1334.0 | 0.026 |
| 1333.0 | 0.024 |
| 1332.0 | 0.024 |
| 1331.0 | 0.025 |
| 1330.0 | 0.023 |
| 1329.0 | 0.024 |
| 1328.0 | 0.023 |
| 1327.0 | 0.021 |
| 1326.0 | 0.022 |
| 1325.0 | 0.022 |
| 1324.0 | 0.019 |
| 1323.0 | 0.019 |
| 1322.0 | 0.022 |
| 1321.0 | 0.024 |
| 1320.0 | 0.02 |
| 1319.0 | 0.02 |
| 1318.0 | 0.022 |
| 1317.0 | 0.022 |
| 1316.0 | 0.021 |
| 1315.0 | 0.021 |
| 1314.0 | 0.021 |
| 1313.0 | 0.019 |
| 1312.0 | 0.02 |
| 1311.0 | 0.021 |
| 1310.0 | 0.019 |
| 1309.0 | 0.019 |
| 1308.0 | 0.019 |
| 1307.0 | 0.018 |
| 1306.0 | 0.019 |
| 1305.0 | 0.018 |
| 1304.0 | 0.02 |
| 1303.0 | 0.02 |
| 1302.0 | 0.017 |
| 1301.0 | 0.02 |
| 1300.0 | 0.018 |
| 1299.0 | 0.02 |
| 1298.0 | 0.02 |
| 1297.0 | 0.017 |
| 1296.0 | 0.02 |
| 1295.0 | 0.018 |
| 1294.0 | 0.014 |
| 1293.0 | 0.019 |
| 1292.0 | 0.018 |
| 1291.0 | 0.015 |
| 1290.0 | 0.02 |
| 1289.0 | 0.017 |
| 1288.0 | 0.017 |
| 1287.0 | 0.018 |
| 1286.0 | 0.018 |
| 1285.0 | 0.017 |
| 1284.0 | 0.018 |
| 1283.0 | 0.018 |
| 1282.0 | 0.017 |
| 1281.0 | 0.019 |
| 1280.0 | 0.015 |
| 1279.0 | 0.017 |
| 1278.0 | 0.018 |
| 1277.0 | 0.014 |
| 1276.0 | 0.016 |
| 1275.0 | 0.017 |
| 1274.0 | 0.017 |
| 1273.0 | 0.018 |
| 1272.0 | 0.017 |
| 1271.0 | 0.018 |
| 1270.0 | 0.014 |
| 1269.0 | 0.017 |
| 1268.0 | 0.018 |
| 1267.0 | 0.017 |
| 1266.0 | 0.018 |
| 1265.0 | 0.017 |
| 1264.0 | 0.015 |
| 1263.0 | 0.018 |
| 1262.0 | 0.015 |
| 1261.0 | 0.016 |
| 1260.0 | 0.018 |
| 1259.0 | 0.016 |
| 1258.0 | 0.015 |
| 1257.0 | 0.017 |
| 1256.0 | 0.017 |
| 1255.0 | 0.015 |
| 1254.0 | 0.015 |
| 1253.0 | 0.018 |
| 1252.0 | 0.018 |
| 1251.0 | 0.017 |
| 1250.0 | 0.015 |
| 1249.0 | 0.015 |
| 1248.0 | 0.016 |
| 1247.0 | 0.016 |
| 1246.0 | 0.017 |
| 1245.0 | 0.017 |
| 1244.0 | 0.014 |
| 1243.0 | 0.017 |
| 1242.0 | 0.016 |
| 1241.0 | 0.014 |
| 1240.0 | 0.015 |
| 1239.0 | 0.017 |
| 1238.0 | 0.018 |
| 1237.0 | 0.014 |
| 1236.0 | 0.016 |
| 1235.0 | 0.018 |
| 1234.0 | 0.014 |
| 1233.0 | 0.018 |
| 1232.0 | 0.014 |
| 1231.0 | 0.018 |
| 1230.0 | 0.014 |
| 1229.0 | 0.017 |
| 1228.0 | 0.016 |
| 1227.0 | 0.017 |
| 1226.0 | 0.014 |
| 1225.0 | 0.017 |
| 1224.0 | 0.017 |
| 1223.0 | 0.014 |
| 1222.0 | 0.016 |
| 1221.0 | 0.016 |
| 1220.0 | 0.019 |
| 1219.0 | 0.015 |
| 1218.0 | 0.015 |
| 1217.0 | 0.015 |
| 1216.0 | 0.015 |
| 1215.0 | 0.017 |
| 1214.0 | 0.017 |
| 1213.0 | 0.017 |
| 1212.0 | 0.016 |
| 1211.0 | 0.017 |
| 1210.0 | 0.016 |
| 1209.0 | 0.015 |
| 1208.0 | 0.017 |
| 1207.0 | 0.017 |
| 1206.0 | 0.019 |
| 1205.0 | 0.018 |
| 1204.0 | 0.014 |
| 1203.0 | 0.016 |
| 1202.0 | 0.017 |
| 1201.0 | 0.016 |
| 1200.0 | 0.016 |
| 1199.0 | 0.022 |
| 1198.0 | 0.017 |
| 1197.0 | 0.016 |
| 1196.0 | 0.016 |
| 1195.0 | 0.019 |
| 1194.0 | 0.017 |
| 1193.0 | 0.017 |
| 1192.0 | 0.016 |
| 1191.0 | 0.016 |
| 1190.0 | 0.015 |
| 1189.0 | 0.015 |
| 1188.0 | 0.015 |
| 1187.0 | 0.015 |
| 1186.0 | 0.017 |
| 1185.0 | 0.017 |
| 1184.0 | 0.015 |
| 1183.0 | 0.017 |
| 1182.0 | 0.016 |
| 1181.0 | 0.016 |
| 1180.0 | 0.016 |
| 1179.0 | 0.017 |
| 1178.0 | 0.017 |
| 1177.0 | 0.018 |
| 1176.0 | 0.016 |
| 1175.0 | 0.018 |
| 1174.0 | 0.014 |
| 1173.0 | 0.015 |
| 1172.0 | 0.018 |
| 1171.0 | 0.014 |
| 1170.0 | 0.016 |
| 1169.0 | 0.016 |
| 1168.0 | 0.014 |
| 1167.0 | 0.018 |
| 1166.0 | 0.016 |
| 1165.0 | 0.015 |
| 1164.0 | 0.016 |
| 1163.0 | 0.014 |
| 1162.0 | 0.015 |
| 1161.0 | 0.016 |
| 1160.0 | 0.017 |
| 1159.0 | 0.015 |
| 1158.0 | 0.015 |
| 1157.0 | 0.017 |
| 1156.0 | 0.016 |
| 1155.0 | 0.017 |
| 1154.0 | 0.016 |
| 1153.0 | 0.017 |
| 1152.0 | 0.019 |
| 1151.0 | 0.015 |
| 1150.0 | 0.018 |
| 1149.0 | 0.014 |
| 1148.0 | 0.015 |
| 1147.0 | 0.014 |
| 1146.0 | 0.014 |
| 1145.0 | 0.016 |
| 1144.0 | 0.015 |
| 1143.0 | 0.018 |
| 1142.0 | 0.018 |
| 1141.0 | 0.016 |
| 1140.0 | 0.016 |
| 1139.0 | 0.016 |
| 1138.0 | 0.016 |
| 1137.0 | 0.018 |
| 1136.0 | 0.017 |
| 1135.0 | 0.016 |
| 1134.0 | 0.019 |
| 1133.0 | 0.017 |
| 1132.0 | 0.017 |
| 1131.0 | 0.018 |
| 1130.0 | 0.017 |
| 1129.0 | 0.019 |
| 1128.0 | 0.017 |
| 1127.0 | 0.016 |
| 1126.0 | 0.018 |
| 1125.0 | 0.016 |
| 1124.0 | 0.014 |
| 1123.0 | 0.016 |
| 1122.0 | 0.017 |
| 1121.0 | 0.018 |
| 1120.0 | 0.015 |
| 1119.0 | 0.018 |
| 1118.0 | 0.015 |
| 1117.0 | 0.013 |
| 1116.0 | 0.017 |
| 1115.0 | 0.016 |
| 1114.0 | 0.015 |
| 1113.0 | 0.016 |
| 1112.0 | 0.017 |
| 1111.0 | 0.015 |
| 1110.0 | 0.018 |
| 1109.0 | 0.017 |
| 1108.0 | 0.016 |
| 1107.0 | 0.015 |
| 1106.0 | 0.015 |
| 1105.0 | 0.016 |
| 1104.0 | 0.017 |
| 1103.0 | 0.017 |
| 1102.0 | 0.018 |
| 1101.0 | 0.016 |
| 1100.0 | 0.016 |
| 1099.0 | 0.018 |
| 1098.0 | 0.018 |
| 1097.0 | 0.015 |
| 1096.0 | 0.016 |
| 1095.0 | 0.016 |
| 1094.0 | 0.017 |
| 1093.0 | 0.015 |
| 1092.0 | 0.018 |
| 1091.0 | 0.016 |
| 1090.0 | 0.015 |
| 1089.0 | 0.016 |
| 1088.0 | 0.017 |
| 1087.0 | 0.016 |
| 1086.0 | 0.016 |
| 1085.0 | 0.016 |
| 1084.0 | 0.015 |
| 1083.0 | 0.02 |
| 1082.0 | 0.016 |
| 1081.0 | 0.015 |
| 1080.0 | 0.018 |
| 1079.0 | 0.016 |
| 1078.0 | 0.014 |
| 1077.0 | 0.018 |
| 1076.0 | 0.016 |
| 1075.0 | 0.015 |
| 1074.0 | 0.016 |
| 1073.0 | 0.017 |
| 1072.0 | 0.017 |
| 1071.0 | 0.016 |
| 1070.0 | 0.017 |
| 1069.0 | 0.015 |
| 1068.0 | 0.014 |
| 1067.0 | 0.017 |
| 1066.0 | 0.019 |
| 1065.0 | 0.016 |
| 1064.0 | 0.016 |
| 1063.0 | 0.016 |
| 1062.0 | 0.016 |
| 1061.0 | 0.015 |
| 1060.0 | 0.018 |
| 1059.0 | 0.016 |
| 1058.0 | 0.015 |
| 1057.0 | 0.017 |
| 1056.0 | 0.016 |
| 1055.0 | 0.016 |
| 1054.0 | 0.015 |
| 1053.0 | 0.015 |
| 1052.0 | 0.016 |
| 1051.0 | 0.016 |
| 1050.0 | 0.018 |
| 1049.0 | 0.016 |
| 1048.0 | 0.016 |
| 1047.0 | 0.016 |
| 1046.0 | 0.015 |
| 1045.0 | 0.018 |
| 1044.0 | 0.014 |
| 1043.0 | 0.016 |
| 1042.0 | 0.015 |
| 1041.0 | 0.015 |
| 1040.0 | 0.016 |
| 1039.0 | 0.018 |
| 1038.0 | 0.014 |
| 1037.0 | 0.017 |
| 1036.0 | 0.017 |
| 1035.0 | 0.016 |
| 1034.0 | 0.017 |
| 1033.0 | 0.016 |
| 1032.0 | 0.019 |
| 1031.0 | 0.016 |
| 1030.0 | 0.015 |
| 1029.0 | 0.019 |
| 1028.0 | 0.016 |
| 1027.0 | 0.014 |
| 1026.0 | 0.016 |
| 1025.0 | 0.017 |
| 1024.0 | 0.017 |
| 1023.0 | 0.014 |
| 1022.0 | 0.017 |
| 1021.0 | 0.017 |
| 1020.0 | 0.018 |
| 1019.0 | 0.017 |
| 1018.0 | 0.014 |
| 1017.0 | 0.018 |
| 1016.0 | 0.017 |
| 1015.0 | 0.015 |
| 1014.0 | 0.017 |
| 1013.0 | 0.016 |
| 1012.0 | 0.017 |
| 1011.0 | 0.019 |
| 1010.0 | 0.014 |
| 1009.0 | 0.013 |
| 1008.0 | 0.017 |
| 1007.0 | 0.017 |
| 1006.0 | 0.017 |
| 1005.0 | 0.013 |
| 1004.0 | 0.015 |
| 1003.0 | 0.017 |
| 1002.0 | 0.019 |
| 1001.0 | 0.015 |
| 1000.0 | 0.018 |
| 999.0 | 0.015 |
| 998.0 | 0.018 |
| 997.0 | 0.015 |
| 996.0 | 0.015 |
| 995.0 | 0.015 |
| 994.0 | 0.016 |
| 993.0 | 0.016 |
| 992.0 | 0.017 |
| 991.0 | 0.016 |
| 990.0 | 0.014 |
| 989.0 | 0.015 |
| 988.0 | 0.018 |
| 987.0 | 0.013 |
| 986.0 | 0.014 |
| 985.0 | 0.016 |
| 984.0 | 0.017 |
| 983.0 | 0.014 |
| 982.0 | 0.017 |
| 981.0 | 0.015 |
| 980.0 | 0.015 |
| 979.0 | 0.016 |
| 978.0 | 0.016 |
| 977.0 | 0.017 |
| 976.0 | 0.015 |
| 975.0 | 0.014 |
| 974.0 | 0.016 |
| 973.0 | 0.016 |
| 972.0 | 0.017 |
| 971.0 | 0.015 |
| 970.0 | 0.016 |
| 969.0 | 0.014 |
| 968.0 | 0.017 |
| 967.0 | 0.015 |
| 966.0 | 0.015 |
| 965.0 | 0.017 |
| 964.0 | 0.017 |
| 963.0 | 0.018 |
| 962.0 | 0.017 |
| 961.0 | 0.015 |
| 960.0 | 0.016 |
| 959.0 | 0.019 |
| 958.0 | 0.016 |
| 957.0 | 0.017 |
| 956.0 | 0.016 |
| 955.0 | 0.015 |
| 954.0 | 0.015 |
| 953.0 | 0.016 |
| 952.0 | 0.015 |
| 951.0 | 0.016 |
| 950.0 | 0.015 |
| 949.0 | 0.016 |
| 948.0 | 0.018 |
| 947.0 | 0.015 |
| 946.0 | 0.017 |
| 945.0 | 0.015 |
| 944.0 | 0.015 |
| 943.0 | 0.015 |
| 942.0 | 0.016 |
| 941.0 | 0.015 |
| 940.0 | 0.017 |
| 939.0 | 0.017 |
| 938.0 | 0.016 |
| 937.0 | 0.016 |
| 936.0 | 0.014 |
| 935.0 | 0.017 |
| 934.0 | 0.018 |
| 933.0 | 0.015 |
| 932.0 | 0.016 |
| 931.0 | 0.014 |
| 930.0 | 0.014 |
| 929.0 | 0.017 |
| 928.0 | 0.015 |
| 927.0 | 0.015 |
| 926.0 | 0.017 |
| 925.0 | 0.017 |
| 924.0 | 0.018 |
| 923.0 | 0.015 |
| 922.0 | 0.018 |
| 921.0 | 0.018 |
| 920.0 | 0.015 |
| 919.0 | 0.017 |
| 918.0 | 0.017 |
| 917.0 | 0.014 |
| 916.0 | 0.012 |
| 915.0 | 0.014 |
| 914.0 | 0.015 |
| 913.0 | 0.014 |
| 912.0 | 0.017 |
| 911.0 | 0.019 |
| 910.0 | 0.014 |
| 909.0 | 0.016 |
| 908.0 | 0.017 |
| 907.0 | 0.016 |
| 906.0 | 0.017 |
| 905.0 | 0.015 |
| 904.0 | 0.017 |
| 903.0 | 0.019 |
| 902.0 | 0.017 |
| 901.0 | 0.017 |
| 900.0 | 0.015 |
| 899.0 | 0.017 |
| 898.0 | 0.018 |
| 897.0 | 0.018 |
| 896.0 | 0.016 |
| 895.0 | 0.017 |
| 894.0 | 0.017 |
| 893.0 | 0.014 |
| 892.0 | 0.016 |
| 891.0 | 0.015 |
| 890.0 | 0.017 |
| 889.0 | 0.018 |
| 888.0 | 0.016 |
| 887.0 | 0.017 |
| 886.0 | 0.018 |
| 885.0 | 0.017 |
| 884.0 | 0.018 |
| 883.0 | 0.017 |
| 882.0 | 0.017 |
| 881.0 | 0.015 |
| 880.0 | 0.017 |
| 879.0 | 0.018 |
| 878.0 | 0.016 |
| 877.0 | 0.016 |
| 876.0 | 0.014 |
| 875.0 | 0.014 |
| 874.0 | 0.018 |
| 873.0 | 0.017 |
| 872.0 | 0.018 |
| 871.0 | 0.015 |
| 870.0 | 0.017 |
| 869.0 | 0.017 |
| 868.0 | 0.016 |
| 867.0 | 0.017 |
| 866.0 | 0.014 |
| 865.0 | 0.017 |
| 864.0 | 0.015 |
| 863.0 | 0.017 |
| 862.0 | 0.016 |
| 861.0 | 0.02 |
| 860.0 | 0.016 |
| 859.0 | 0.015 |
| 858.0 | 0.016 |
| 857.0 | 0.018 |
| 856.0 | 0.016 |
| 855.0 | 0.014 |
| 854.0 | 0.018 |
| 853.0 | 0.017 |
| 852.0 | 0.017 |
| 851.0 | 0.016 |
| 850.0 | 0.015 |
| 849.0 | 0.016 |
| 848.0 | 0.017 |
| 847.0 | 0.014 |
| 846.0 | 0.016 |
| 845.0 | 0.015 |
| 844.0 | 0.016 |
| 843.0 | 0.015 |
| 842.0 | 0.014 |
| 841.0 | 0.015 |
| 840.0 | 0.015 |
| 839.0 | 0.017 |
| 838.0 | 0.016 |
| 837.0 | 0.014 |
| 836.0 | 0.016 |
| 835.0 | 0.017 |
| 834.0 | 0.015 |
| 833.0 | 0.015 |
| 832.0 | 0.015 |
| 831.0 | 0.012 |
| 830.0 | 0.016 |
| 829.0 | 0.016 |
| 828.0 | 0.016 |
| 827.0 | 0.016 |
| 826.0 | 0.016 |
| 825.0 | 0.016 |
| 824.0 | 0.015 |
| 823.0 | 0.018 |
| 822.0 | 0.015 |
| 821.0 | 0.018 |
| 820.0 | 0.014 |
| 819.0 | 0.016 |
| 818.0 | 0.017 |
| 817.0 | 0.015 |
| 816.0 | 0.018 |
| 815.0 | 0.017 |
| 814.0 | 0.015 |
| 813.0 | 0.014 |
| 812.0 | 0.016 |
| 811.0 | 0.015 |
| 810.0 | 0.017 |
| 809.0 | 0.015 |
| 808.0 | 0.015 |
| 807.0 | 0.015 |
| 806.0 | 0.015 |
| 805.0 | 0.016 |
| 804.0 | 0.014 |
| 803.0 | 0.016 |
| 802.0 | 0.017 |
| 801.0 | 0.016 |
| 800.0 | 0.017 |
| 799.0 | 0 |
| 798.0 | 0 |
| 797.0 | 0 |
| 796.0 | 0 |
| 795.0 | 0 |
| 794.0 | 0 |
| 793.0 | 0 |
| 792.0 | 0 |
| 791.0 | 0 |
| 790.0 | 0 |
| 789.0 | 0 |
| 788.0 | 0 |
| 787.0 | 0 |
| 786.0 | 0 |
| 785.0 | 0 |
| 784.0 | 0 |
| 783.0 | 0 |
| 782.0 | 0 |
| 781.0 | 0 |
| 780.0 | 0 |
| 779.0 | 0 |
| 778.0 | 0 |
| 777.0 | 0 |
| 776.0 | 0 |
| 775.0 | 0 |
| 774.0 | 0 |
| 773.0 | 0 |
| 772.0 | 0 |
| 771.0 | 0 |
| 770.0 | 0 |
| 769.0 | 0 |
| 768.0 | 0 |
| 767.0 | 0 |
| 766.0 | 0 |
| 765.0 | 0 |
| 764.0 | 0 |
| 763.0 | 0 |
| 762.0 | 0 |
| 761.0 | 0 |
| 760.0 | 0 |
| 759.0 | 0 |
| 758.0 | 0 |
| 757.0 | 0 |
| 756.0 | 0 |
| 755.0 | 0 |
| 754.0 | 0 |
| 753.0 | 0 |
| 752.0 | 0 |
| 751.0 | 0 |
| 750.0 | 0 |
| 749.0 | 0 |
| 748.0 | 0 |
| 747.0 | 0 |
| 746.0 | 0 |
| 745.0 | 0 |
| 744.0 | 0 |
| 743.0 | 0 |
| 742.0 | 0 |
| 741.0 | 0 |
| 740.0 | 0 |
| 739.0 | 0 |
| 738.0 | 0 |
| 737.0 | 0 |
| 736.0 | 0 |
| 735.0 | 0 |
| 734.0 | 0 |
| 733.0 | 0 |
| 732.0 | 0 |
| 731.0 | 0 |
| 730.0 | 0 |
| 729.0 | 0 |
| 728.0 | 0 |
| 727.0 | 0 |
| 726.0 | 0 |
| 725.0 | 0 |
| 724.0 | 0 |
| 723.0 | 0 |
| 722.0 | 0 |
| 721.0 | 0 |
| 720.0 | 0 |
| 719.0 | 0 |
| 718.0 | 0 |
| 717.0 | 0 |
| 716.0 | 0 |
| 715.0 | 0 |
| 714.0 | 0 |
| 713.0 | 0 |
| 712.0 | 0 |
| 711.0 | 0 |
| 710.0 | 0 |
| 709.0 | 0 |
| 708.0 | 0 |
| 707.0 | 0 |
| 706.0 | 0 |
| 705.0 | 0 |
| 704.0 | 0 |
| 703.0 | 0 |
| 702.0 | 0 |
| 701.0 | 0 |
| 700.0 | 0 |
| 699.0 | 0 |
| 698.0 | 0 |
| 697.0 | 0 |
| 696.0 | 0 |
| 695.0 | 0 |
| 694.0 | 0 |
| 693.0 | 0 |
| 692.0 | 0 |
| 691.0 | 0 |
| 690.0 | 0 |
| 689.0 | 0 |
| 688.0 | 0 |
| 687.0 | 0 |
| 686.0 | 0 |
| 685.0 | 0 |
| 684.0 | 0 |
| 683.0 | 0 |
| 682.0 | 0 |
| 681.0 | 0 |
| 680.0 | 0 |
| 679.0 | 0 |
| 678.0 | 0 |
| 677.0 | 0 |
| 676.0 | 0 |
| 675.0 | 0 |
| 674.0 | 0 |
| 673.0 | 0 |
| 672.0 | 0 |
| 671.0 | 0 |
| 670.0 | 0 |
| 669.0 | 0 |
| 668.0 | 0 |
| 667.0 | 0 |
| 666.0 | 0 |
| 665.0 | 0 |
| 664.0 | 0 |
| 663.0 | 0 |
| 662.0 | 0 |
| 661.0 | 0 |
| 660.0 | 0 |
| 659.0 | 0 |
| 658.0 | 0 |
| 657.0 | 0 |
| 656.0 | 0 |
| 655.0 | 0 |
| 654.0 | 0 |
| 653.0 | 0 |
| 652.0 | 0 |
| 651.0 | 0 |
| 650.0 | 0 |
| 649.0 | 0 |
| 648.0 | 0 |
| 647.0 | 0 |
| 646.0 | 0 |
| 645.0 | 0 |
| 644.0 | 0 |
| 643.0 | 0 |
| 642.0 | 0 |
| 641.0 | 0 |
| 640.0 | 0 |
| 639.0 | 0 |
| 638.0 | 0 |
| 637.0 | 0 |
| 636.0 | 0 |
| 635.0 | 0 |
| 634.0 | 0 |
| 633.0 | 0 |
| 632.0 | 0 |
| 631.0 | 0 |
| 630.0 | 0 |
| 629.0 | 0 |
| 628.0 | 0 |
| 627.0 | 0 |
| 626.0 | 0 |
| 625.0 | 0 |
| 624.0 | 0 |
| 623.0 | 0 |
| 622.0 | 0 |
| 621.0 | 0 |
| 620.0 | 0 |
| 619.0 | 0 |
| 618.0 | 0 |
| 617.0 | 0 |
| 616.0 | 0 |
| 615.0 | 0 |
| 614.0 | 0 |
| 613.0 | 0 |
| 612.0 | 0 |
| 611.0 | 0 |
| 610.0 | 0 |
| 609.0 | 0 |
| 608.0 | 0 |
| 607.0 | 0 |
| 606.0 | 0 |
| 605.0 | 0 |
| 604.0 | 0 |
| 603.0 | 0 |
| 602.0 | 0 |
| 601.0 | 0 |
| 600.0 | 0 |
| 599.0 | 0 |
| 598.0 | 0 |
| 597.0 | 0 |
| 596.0 | 0 |
| 595.0 | 0 |
| 594.0 | 0 |
| 593.0 | 0 |
| 592.0 | 0 |
| 591.0 | 0 |
| 590.0 | 0 |
| 589.0 | 0 |
| 588.0 | 0 |
| 587.0 | 0 |
| 586.0 | 0 |
| 585.0 | 0 |
| 584.0 | 0 |
| 583.0 | 0 |
| 582.0 | 0 |
| 581.0 | 0 |
| 580.0 | 0 |
| 579.0 | 0 |
| 578.0 | 0 |
| 577.0 | 0 |
| 576.0 | 0 |
| 575.0 | 0 |
| 574.0 | 0 |
| 573.0 | 0 |
| 572.0 | 0 |
| 571.0 | 0 |
| 570.0 | 0 |
| 569.0 | 0 |
| 568.0 | 0 |
| 567.0 | 0 |
| 566.0 | 0 |
| 565.0 | 0 |
| 564.0 | 0 |
| 563.0 | 0 |
| 562.0 | 0 |
| 561.0 | 0 |
| 560.0 | 0 |
| 559.0 | 0 |
| 558.0 | 0 |
| 557.0 | 0 |
| 556.0 | 0 |
| 555.0 | 0 |
| 554.0 | 0 |
| 553.0 | 0 |
| 552.0 | 0 |
| 551.0 | 0 |
| 550.0 | 0 |
| 549.0 | 0 |
| 548.0 | 0 |
| 547.0 | 0 |
| 546.0 | 0 |
| 545.0 | 0 |
| 544.0 | 0 |
| 543.0 | 0 |
| 542.0 | 0 |
| 541.0 | 0 |
| 540.0 | 0 |
| 539.0 | 0 |
| 538.0 | 0 |
| 537.0 | 0 |
| 536.0 | 0 |
| 535.0 | 0 |
| 534.0 | 0 |
| 533.0 | 0 |
| 532.0 | 0 |
| 531.0 | 0 |
| 530.0 | 0 |
| 529.0 | 0 |
| 528.0 | 0 |
| 527.0 | 0 |
| 526.0 | 0 |
| 525.0 | 0 |
| 524.0 | 0 |
| 523.0 | 0 |
| 522.0 | 0 |
| 521.0 | 0 |
| 520.0 | 0 |
| 519.0 | 0 |
| 518.0 | 0 |
| 517.0 | 0 |
| 516.0 | 0 |
| 515.0 | 0 |
| 514.0 | 0 |
| 513.0 | 0 |
| 512.0 | 0 |
| 511.0 | 0 |
| 510.0 | 0 |
| 509.0 | 0 |
| 508.0 | 0 |
| 507.0 | 0 |
| 506.0 | 0 |
| 505.0 | 0 |
| 504.0 | 0 |
| 503.0 | 0 |
| 502.0 | 0 |
| 501.0 | 0 |
| 500.0 | 0 |
| 499.0 | 0 |
| 498.0 | 0.001 |
| 497.0 | 0.001 |
| 496.0 | 0.001 |
| 495.0 | 0.002 |
| 494.0 | 0.002 |
| 493.0 | 0.002 |
| 492.0 | 0.002 |
| 491.0 | 0.002 |
| 490.0 | 0.002 |
| 489.0 | 0.002 |
| 488.0 | 0.002 |
| 487.0 | 0.002 |
| 486.0 | 0.002 |
| 485.0 | 0.003 |
| 484.0 | 0.003 |
| 483.0 | 0.003 |
| 482.0 | 0.003 |
| 481.0 | 0.003 |
| 480.0 | 0.003 |
| 479.0 | 0.004 |
| 478.0 | 0.004 |
| 477.0 | 0.004 |
| 476.0 | 0.005 |
| 475.0 | 0.005 |
| 474.0 | 0.006 |
| 473.0 | 0.007 |
| 472.0 | 0.007 |
| 471.0 | 0.008 |
| 470.0 | 0.01 |
| 469.0 | 0.011 |
| 468.0 | 0.013 |
| 467.0 | 0.015 |
| 466.0 | 0.018 |
| 465.0 | 0.022 |
| 464.0 | 0.027 |
| 463.0 | 0.034 |
| 462.0 | 0.043 |
| 461.0 | 0.056 |
| 460.0 | 0.074 |
| 459.0 | 0.1 |
| 458.0 | 0.138 |
| 457.0 | 0.196 |
| 456.0 | 0.286 |
| 455.0 | 0.432 |
| 454.0 | 0.687 |
| 453.0 | 1.151 |
| 452.0 | 2.058 |
| 451.0 | 3.969 |
| 450.0 | 8.075 |
| 449.0 | 16.801 |
| 448.0 | 32.06 |
| 447.0 | 51.126 |
| 446.0 | 66.603 |
| 445.0 | 74.143 |
| 444.0 | 76.135 |
| 443.0 | 76.403 |
| 442.0 | 76.143 |
| 441.0 | 75.342 |
| 440.0 | 73.815 |
| 439.0 | 69.404 |
| 438.0 | 57.942 |
| 437.0 | 39.792 |
| 436.0 | 21.763 |
| 435.0 | 10.042 |
| 434.0 | 4.463 |
| 433.0 | 2.072 |
| 432.0 | 1.034 |
| 431.0 | 0.556 |
| 430.0 | 0.319 |
| 429.0 | 0.193 |
| 428.0 | 0.12 |
| 427.0 | 0.079 |
| 426.0 | 0.053 |
| 425.0 | 0.036 |
| 424.0 | 0.025 |
| 423.0 | 0.018 |
| 422.0 | 0.013 |
| 421.0 | 0.01 |
| 420.0 | 0.008 |
| 419.0 | 0.006 |
| 418.0 | 0.004 |
| 417.0 | 0.004 |
| 416.0 | 0.003 |
| 415.0 | 0.002 |
| 414.0 | 0.002 |
| 413.0 | 0.001 |
| 412.0 | 0 |
| 411.0 | 0 |
| 410.0 | 0 |
| 409.0 | 0 |
| 408.0 | 0 |
| 407.0 | 0 |
| 406.0 | 0 |
| 405.0 | 0 |
| 404.0 | 0 |
| 403.0 | 0 |
| 402.0 | 0 |
| 401.0 | 0 |
| 400.0 | 0 |
| 399.0 | 0 |
| 398.0 | 0 |
| 397.0 | 0 |
| 396.0 | 0 |
| 395.0 | 0 |
| 394.0 | 0 |
| 393.0 | 0 |
| 392.0 | 0 |
| 391.0 | 0 |
| 390.0 | 0 |
| 389.0 | 0 |
| 388.0 | 0 |
| 387.0 | 0 |
| 386.0 | 0 |
| 385.0 | 0 |
| 384.0 | 0 |
| 383.0 | 0 |
| 382.0 | 0 |
| 381.0 | 0 |
| 380.0 | 0 |
| 379.0 | 0 |
| 378.0 | 0 |
| 377.0 | 0 |
| 376.0 | 0 |
| 375.0 | 0 |
| 374.0 | 0 |
| 373.0 | 0 |
| 372.0 | 0 |
| 371.0 | 0 |
| 370.0 | 0 |
| 369.0 | 0 |
| 368.0 | 0 |
| 367.0 | 0 |
| 366.0 | 0 |
| 365.0 | 0 |
| 364.0 | 0 |
| 363.0 | 0 |
| 362.0 | 0 |
| 361.0 | 0 |
| 360.0 | 0 |
| 359.0 | 0 |
| 358.0 | 0 |
| 357.0 | 0 |
| 356.0 | 0 |
| 355.0 | 0 |
| 354.0 | 0 |
| 353.0 | 0 |
| 352.0 | 0 |
| 351.0 | 0 |
| 350.0 | 0 |
| 349.0 | 0.001 |
| 348.0 | 0 |
| 347.0 | 0 |
| 346.0 | 0 |
| 345.0 | 0 |
| 344.0 | 0 |
| 343.0 | 0 |
| 342.0 | 0 |
| 341.0 | 0 |
| 340.0 | 0 |
| 339.0 | 0 |
| 338.0 | 0 |
| 337.0 | 0 |
| 336.0 | 0 |
| 335.0 | 0 |
| 334.0 | 0 |
| 333.0 | 0 |
| 332.0 | 0 |
| 331.0 | 0 |
| 330.0 | 0 |
| 329.0 | 0 |
| 328.0 | 0 |
| 327.0 | 0 |
| 326.0 | 0 |
| 325.0 | 0 |
| 324.0 | 0 |
| 323.0 | 0 |
| 322.0 | 0 |
| 321.0 | 0 |
| 320.0 | 0 |
| 319.0 | 0 |
| 318.0 | 0 |
| 317.0 | 0 |
| 316.0 | 0 |
| 315.0 | 0 |
| 314.0 | 0 |
| 313.0 | 0 |
| 312.0 | 0 |
| 311.0 | 0 |
| 310.0 | 0 |
| 309.0 | 0 |
| 308.0 | 0 |
| 307.0 | 0 |
| 306.0 | 0 |
| 305.0 | 0 |
| 304.0 | 0 |
| 303.0 | 0 |
| 302.0 | 0 |
| 301.0 | 0 |
| 300.0 | 0 |
| 299.0 | 0 |
| 298.0 | 0 |
| 297.0 | 0 |
| 296.0 | 0 |
| 295.0 | 0 |
| 294.0 | 0 |
| 293.0 | 0 |
| 292.0 | 0 |
| 291.0 | 0 |
| 290.0 | 0 |
| 289.0 | 0 |
| 288.0 | 0 |
| 287.0 | 0 |
| 286.0 | 0 |
| 285.0 | 0 |
| 284.0 | 0 |
| 283.0 | 0 |
| 282.0 | 0 |
| 281.0 | 0 |
| 280.0 | 0 |
| 279.0 | 0 |
| 278.0 | 0 |
| 277.0 | 0 |
| 276.0 | 0 |
| 275.0 | 0 |
| 274.0 | 0 |
| 273.0 | 0 |
| 272.0 | 0 |
| 271.0 | 0 |
| 270.0 | 0 |
| 269.0 | 0 |
| 268.0 | 0 |
| 267.0 | 0 |
| 266.0 | 0 |
| 265.0 | 0 |
| 264.0 | 0 |
| 263.0 | 0 |
| 262.0 | 0 |
| 261.0 | 0 |
| 260.0 | 0 |
| 259.0 | 0 |
| 258.0 | 0 |
| 257.0 | 0 |
| 256.0 | 0 |
| 255.0 | 0 |
| 254.0 | 0 |
| 253.0 | 0 |
| 252.0 | 0 |
| 251.0 | 0 |
| 250.0 | 0 |
| 249.0 | 0 |
| 248.0 | 0 |
| 247.0 | 0 |
| 246.0 | 0 |
| 245.0 | 0 |
| 244.0 | 0 |
| 243.0 | 0 |
| 242.0 | 0 |
| 241.0 | 0 |
| 240.0 | 0 |
| 239.0 | 0 |
| 238.0 | 0 |
| 237.0 | 0 |
| 236.0 | 0 |
| 235.0 | 0 |
| 234.0 | 0 |
| 233.0 | 0 |
| 232.0 | 0 |
| 231.0 | 0 |
| 230.0 | 0 |
| 229.0 | 0 |
| 228.0 | 0 |
| 227.0 | 0 |
| 226.0 | 0 |
| 225.0 | 0 |
| 224.0 | 0 |
| 223.0 | 0 |
| 222.0 | 0 |
| 221.0 | 0 |
| 220.0 | 0 |
| 219.0 | 0 |
| 218.0 | 0 |
| 217.0 | 0 |
| 216.0 | 0 |
| 215.0 | 0 |
| 214.0 | 0 |
| 213.0 | 0 |
| 212.0 | 0 |
| 211.0 | 0 |
| 210.0 | 0 |
| 209.0 | 0 |
| 208.0 | 0 |
| 207.0 | 0 |
| 206.0 | 0 |
| 205.0 | 0 |
| 204.0 | 0 |
| 203.0 | 0 |
| 202.0 | 0 |
| 201.0 | 0 |